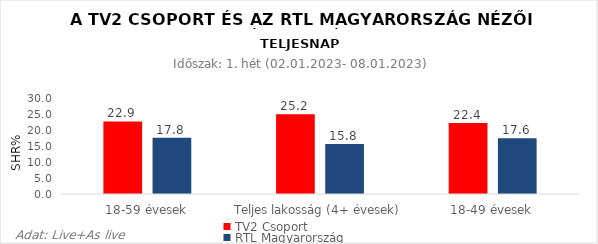
| Category | TV2 Csoport | RTL Magyarország |
|---|---|---|
| 18-59 évesek | 22.9 | 17.8 |
| Teljes lakosság (4+ évesek) | 25.2 | 15.8 |
| 18-49 évesek | 22.4 | 17.6 |